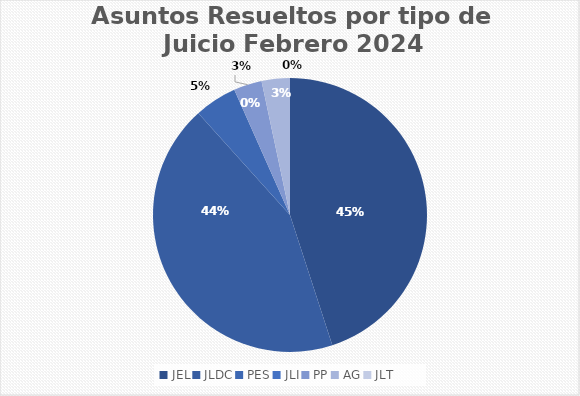
| Category | Asuntos Resueltos por tipo de Juicio  FEBRERO |
|---|---|
| JEL | 27 |
| JLDC | 26 |
| PES | 3 |
| JLI | 0 |
| PP | 2 |
| AG | 2 |
| JLT | 0 |